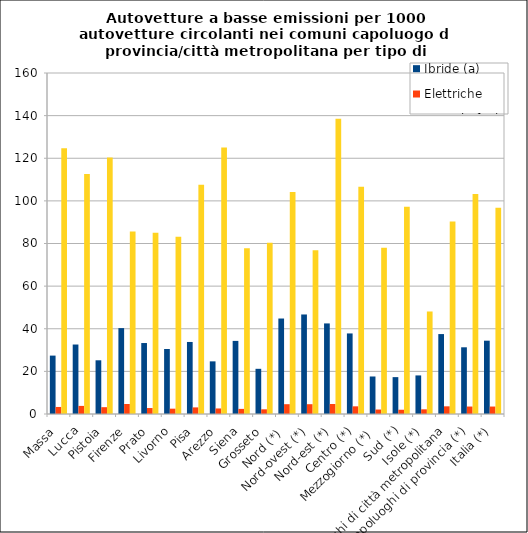
| Category | Ibride (a) | Elettriche | Gas e bi-fuel (b) |
|---|---|---|---|
| Massa | 27.4 | 3.3 | 124.7 |
| Lucca | 32.6 | 3.8 | 112.6 |
| Pistoia | 25.2 | 3.2 | 120.3 |
| Firenze | 40.3 | 4.7 | 85.6 |
| Prato | 33.3 | 2.8 | 85 |
| Livorno | 30.5 | 2.5 | 83.2 |
| Pisa | 33.8 | 3.1 | 107.6 |
| Arezzo | 24.7 | 2.6 | 125.1 |
| Siena | 34.3 | 2.4 | 77.8 |
| Grosseto | 21.2 | 2.2 | 80.4 |
| Nord (*)  | 44.8 | 4.6 | 104.2 |
| Nord-ovest (*) | 46.7 | 4.6 | 76.8 |
| Nord-est (*) | 42.5 | 4.7 | 138.5 |
| Centro (*) | 37.8 | 3.6 | 106.6 |
| Mezzogiorno (*)  | 17.6 | 2.1 | 78 |
| Sud (*) | 17.3 | 2 | 97.3 |
| Isole (*) | 18.1 | 2.2 | 48.1 |
| Capoluoghi di città metropolitana | 37.5 | 3.6 | 90.3 |
| Capoluoghi di provincia (*) | 31.3 | 3.5 | 103.2 |
| Italia (*) | 34.4 | 3.5 | 96.8 |